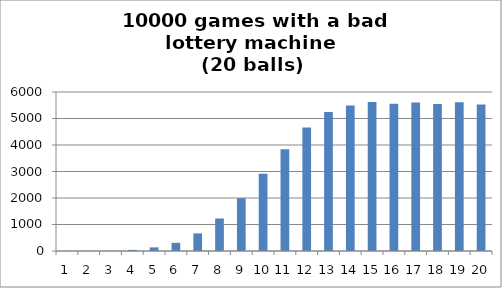
| Category | Series 0 |
|---|---|
| 0 | 0 |
| 1 | 4 |
| 2 | 9 |
| 3 | 42 |
| 4 | 137 |
| 5 | 308 |
| 6 | 664 |
| 7 | 1226 |
| 8 | 1992 |
| 9 | 2916 |
| 10 | 3838 |
| 11 | 4661 |
| 12 | 5250 |
| 13 | 5489 |
| 14 | 5621 |
| 15 | 5558 |
| 16 | 5602 |
| 17 | 5546 |
| 18 | 5609 |
| 19 | 5528 |